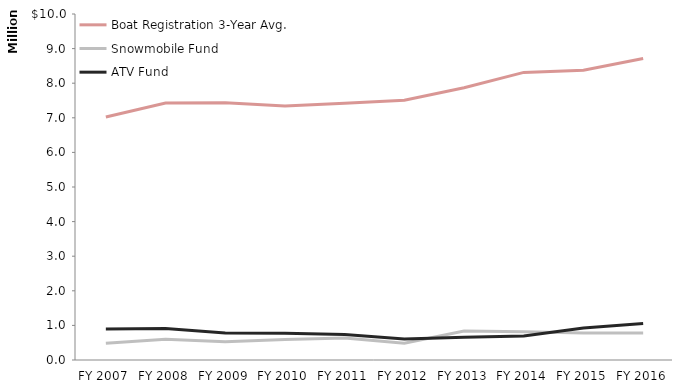
| Category | Boat Registration 3-Year Avg. | Snowmobile Fund | ATV Fund |
|---|---|---|---|
| 2007.0 | 7024085 | 483912 | 898196 |
| 2008.0 | 7427965 | 599695 | 910800 |
| 2009.0 | 7433228 | 524128 | 779007 |
| 2010.0 | 7340282 | 592625 | 771407 |
| 2011.0 | 7423490 | 638611 | 734457 |
| 2012.0 | 7508865 | 483054 | 607142 |
| 2013.0 | 7869784 | 838722 | 658776 |
| 2014.0 | 8312503 | 819033 | 696821 |
| 2015.0 | 8373064.2 | 782977 | 924401 |
| 2016.0 | 8716647.2 | 781187 | 1053443 |